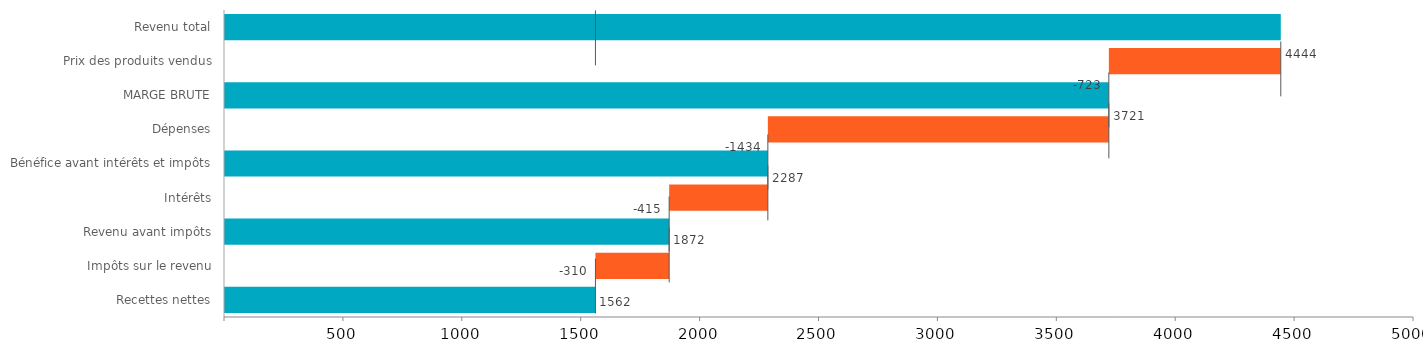
| Category | Fins | Vide | Perte neg | Gain neg | Perte pos | Gain pos |
|---|---|---|---|---|---|---|
| Revenu total | 4444 | 0 | 0 | 0 | 0 | 0 |
| Prix des produits vendus | 0 | 3721 | 0 | 0 | 723 | 0 |
| MARGE BRUTE | 3721 | 0 | 0 | 0 | 0 | 0 |
| Dépenses | 0 | 2287 | 0 | 0 | 1434 | 0 |
| Bénéfice avant intérêts et impôts | 2287 | 0 | 0 | 0 | 0 | 0 |
| Intérêts | 0 | 1872 | 0 | 0 | 415 | 0 |
| Revenu avant impôts | 1872 | 0 | 0 | 0 | 0 | 0 |
| Impôts sur le revenu | 0 | 1562 | 0 | 0 | 310 | 0 |
| Recettes nettes | 1562 | 0 | 0 | 0 | 0 | 0 |